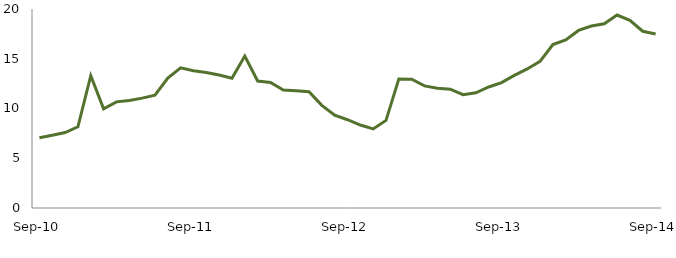
| Category | Series 0 |
|---|---|
| Sep-10 | 7.07 |
|  | 7.319 |
|  | 7.58 |
|  | 8.163 |
|  | 13.299 |
|  | 9.962 |
|  | 10.668 |
|  | 10.801 |
|  | 11.043 |
|  | 11.347 |
|  | 13.063 |
|  | 14.083 |
| Sep-11 | 13.787 |
|  | 13.621 |
|  | 13.374 |
|  | 13.036 |
|  | 15.271 |
|  | 12.765 |
|  | 12.617 |
|  | 11.855 |
|  | 11.781 |
|  | 11.679 |
|  | 10.318 |
|  | 9.321 |
| Sep-12 | 8.873 |
|  | 8.337 |
|  | 7.949 |
|  | 8.805 |
|  | 12.972 |
|  | 12.942 |
|  | 12.269 |
|  | 12.044 |
|  | 11.937 |
|  | 11.385 |
|  | 11.582 |
|  | 12.163 |
| Sep-13 | 12.602 |
|  | 13.328 |
|  | 13.977 |
|  | 14.732 |
|  | 16.419 |
|  | 16.896 |
|  | 17.846 |
|  | 18.295 |
|  | 18.518 |
|  | 19.397 |
|  | 18.858 |
|  | 17.765 |
| Sep-14 | 17.489 |